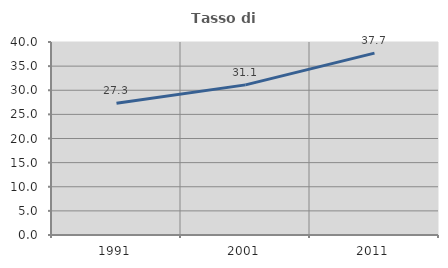
| Category | Tasso di occupazione   |
|---|---|
| 1991.0 | 27.309 |
| 2001.0 | 31.113 |
| 2011.0 | 37.69 |